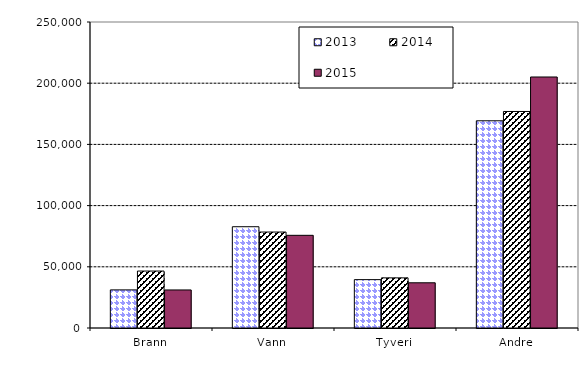
| Category | 2013 | 2014 | 2015 |
|---|---|---|---|
| Brann | 31147 | 46530 | 31084.432 |
| Vann | 82744 | 78404 | 75724.329 |
| Tyveri | 39521 | 40957 | 36932.784 |
| Andre | 169287 | 176904 | 205070.17 |